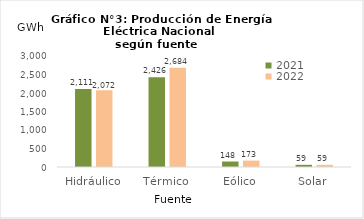
| Category | 2021 | 2022 |
|---|---|---|
| Hidráulico | 2111.461 | 2072.217 |
| Térmico | 2425.62 | 2684.051 |
| Eólico | 147.897 | 172.722 |
| Solar | 58.635 | 58.952 |